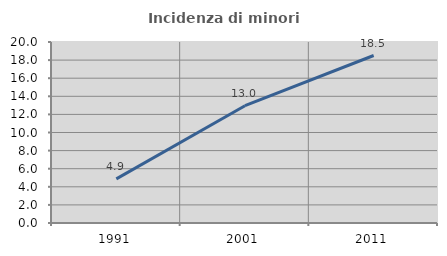
| Category | Incidenza di minori stranieri |
|---|---|
| 1991.0 | 4.878 |
| 2001.0 | 12.963 |
| 2011.0 | 18.508 |